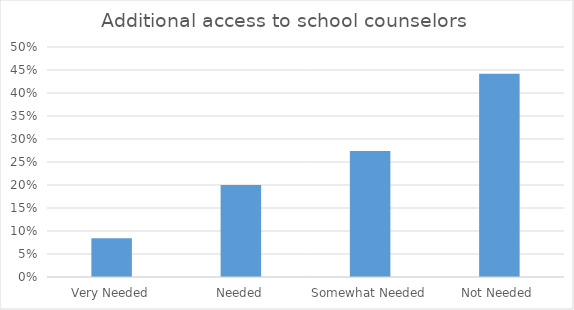
| Category | Additional access to school counselors  |
|---|---|
| Very Needed | 0.084 |
| Needed | 0.2 |
| Somewhat Needed | 0.274 |
| Not Needed | 0.442 |